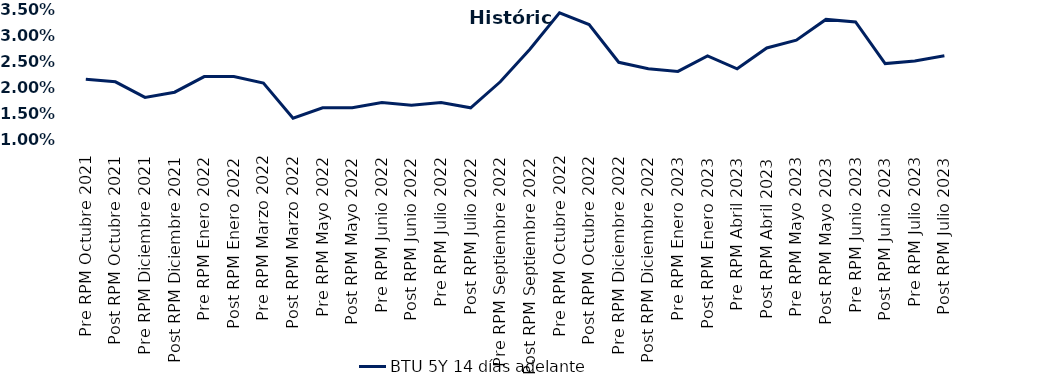
| Category | BTU 5Y 14 días adelante |
|---|---|
| Pre RPM Octubre 2021 | 0.022 |
| Post RPM Octubre 2021 | 0.021 |
| Pre RPM Diciembre 2021 | 0.018 |
| Post RPM Diciembre 2021 | 0.019 |
| Pre RPM Enero 2022 | 0.022 |
| Post RPM Enero 2022 | 0.022 |
| Pre RPM Marzo 2022 | 0.021 |
| Post RPM Marzo 2022 | 0.014 |
| Pre RPM Mayo 2022 | 0.016 |
| Post RPM Mayo 2022 | 0.016 |
| Pre RPM Junio 2022 | 0.017 |
| Post RPM Junio 2022 | 0.016 |
| Pre RPM Julio 2022 | 0.017 |
| Post RPM Julio 2022 | 0.016 |
| Pre RPM Septiembre 2022 | 0.021 |
| Post RPM Septiembre 2022 | 0.027 |
| Pre RPM Octubre 2022 | 0.034 |
| Post RPM Octubre 2022 | 0.032 |
| Pre RPM Diciembre 2022 | 0.025 |
| Post RPM Diciembre 2022 | 0.024 |
| Pre RPM Enero 2023 | 0.023 |
| Post RPM Enero 2023 | 0.026 |
| Pre RPM Abril 2023 | 0.024 |
| Post RPM Abril 2023 | 0.028 |
| Pre RPM Mayo 2023 | 0.029 |
| Post RPM Mayo 2023 | 0.033 |
| Pre RPM Junio 2023 | 0.032 |
| Post RPM Junio 2023 | 0.024 |
| Pre RPM Julio 2023 | 0.025 |
| Post RPM Julio 2023 | 0.026 |